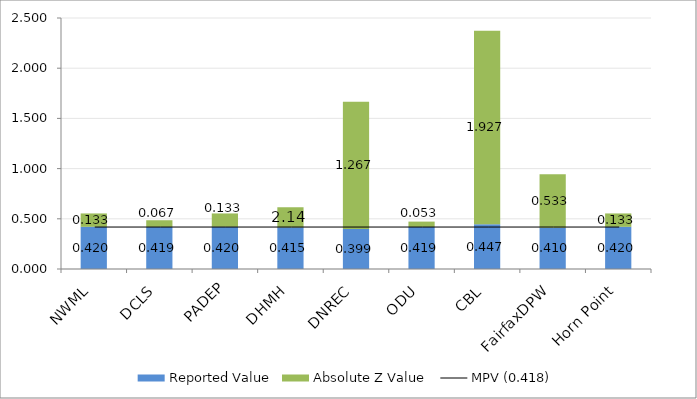
| Category | Reported Value | Absolute Z Value  |
|---|---|---|
| NWML | 0.42 | 0.133 |
| DCLS | 0.419 | 0.067 |
| PADEP | 0.42 | 0.133 |
| DHMH | 0.415 | 0.2 |
| DNREC | 0.399 | 1.267 |
| ODU | 0.419 | 0.053 |
| CBL | 0.447 | 1.927 |
| FairfaxDPW | 0.41 | 0.533 |
| Horn Point | 0.42 | 0.133 |